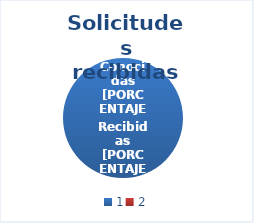
| Category | Series 0 |
|---|---|
| 0 | 301 |
| 1 | 0 |